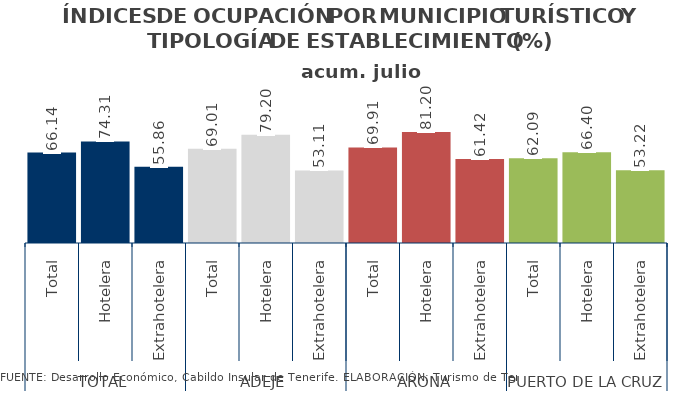
| Category | acum. julio 2014 |
|---|---|
| 0 | 66.143 |
| 1 | 74.308 |
| 2 | 55.855 |
| 3 | 69.009 |
| 4 | 79.196 |
| 5 | 53.106 |
| 6 | 69.909 |
| 7 | 81.202 |
| 8 | 61.421 |
| 9 | 62.093 |
| 10 | 66.397 |
| 11 | 53.225 |